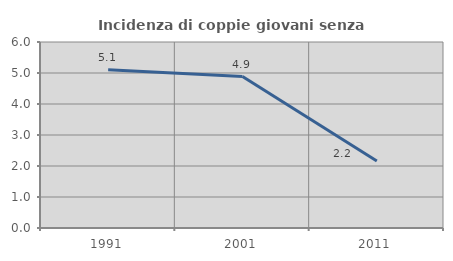
| Category | Incidenza di coppie giovani senza figli |
|---|---|
| 1991.0 | 5.102 |
| 2001.0 | 4.885 |
| 2011.0 | 2.162 |